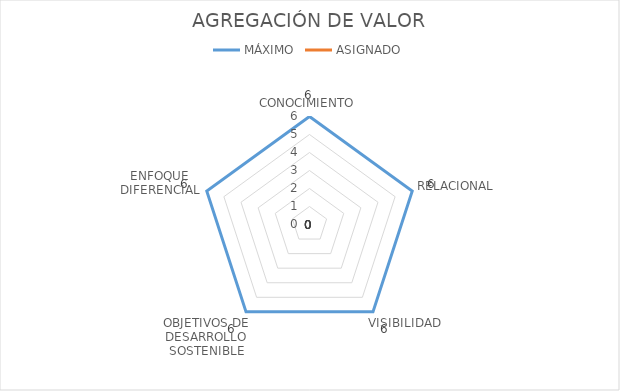
| Category | MÁXIMO | ASIGNADO |
|---|---|---|
| CONOCIMIENTO | 6 | 0 |
| RELACIONAL | 6 | 0 |
| VISIBILIDAD | 6 | 0 |
| OBJETIVOS DE DESARROLLO SOSTENIBLE | 6 | 0 |
| ENFOQUE DIFERENCIAL | 6 | 0 |